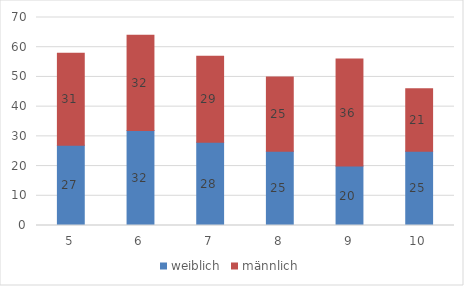
| Category | weiblich | männlich |
|---|---|---|
| 5.0 | 27 | 31 |
| 6.0 | 32 | 32 |
| 7.0 | 28 | 29 |
| 8.0 | 25 | 25 |
| 9.0 | 20 | 36 |
| 10.0 | 25 | 21 |